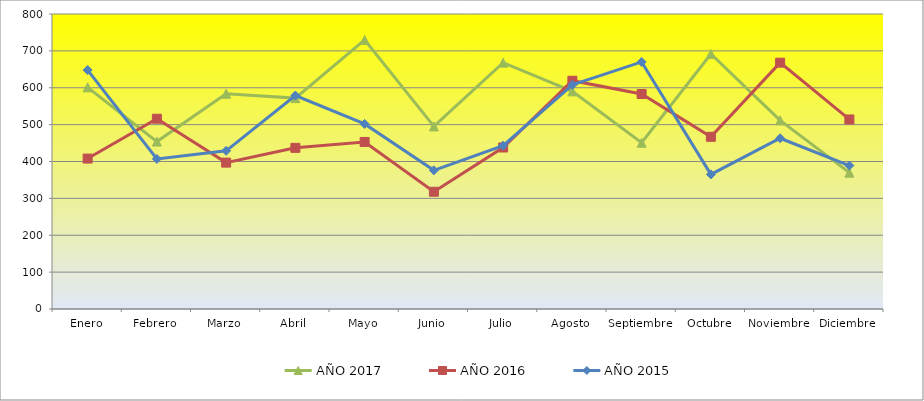
| Category | AÑO 2017 | AÑO 2016 | AÑO 2015 |
|---|---|---|---|
| Enero | 601.081 | 408 | 648 |
| Febrero | 454.054 | 516 | 407 |
| Marzo | 583.784 | 397 | 429 |
| Abril | 571.892 | 437 | 579 |
| Mayo | 729.73 | 453 | 502 |
| Junio | 495.135 | 318 | 376 |
| Julio | 668.108 | 438 | 443 |
| Agosto | 590.27 | 619 | 608 |
| Septiembre | 450.811 | 583 | 670 |
| Octubre | 691.579 | 467 | 365 |
| Noviembre | 511.579 | 668 | 463 |
| Diciembre | 369.73 | 514 | 389 |